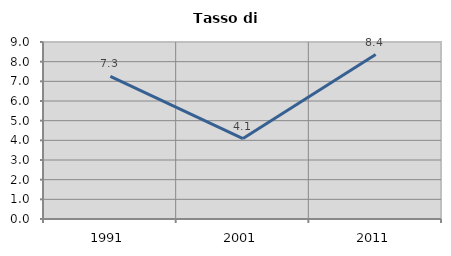
| Category | Tasso di disoccupazione   |
|---|---|
| 1991.0 | 7.257 |
| 2001.0 | 4.089 |
| 2011.0 | 8.362 |